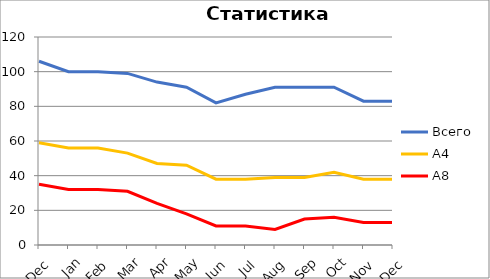
| Category | Всего | А4 | A8 |
|---|---|---|---|
| 0 | 106 | 59 | 35 |
| 1 | 100 | 56 | 32 |
| 2 | 100 | 56 | 32 |
| 3 | 99 | 53 | 31 |
| 4 | 94 | 47 | 24 |
| 5 | 91 | 46 | 18 |
| 6 | 82 | 38 | 11 |
| 7 | 87 | 38 | 11 |
| 8 | 91 | 39 | 9 |
| 9 | 91 | 39 | 15 |
| 10 | 91 | 42 | 16 |
| 11 | 83 | 38 | 13 |
| 12 | 83 | 38 | 13 |